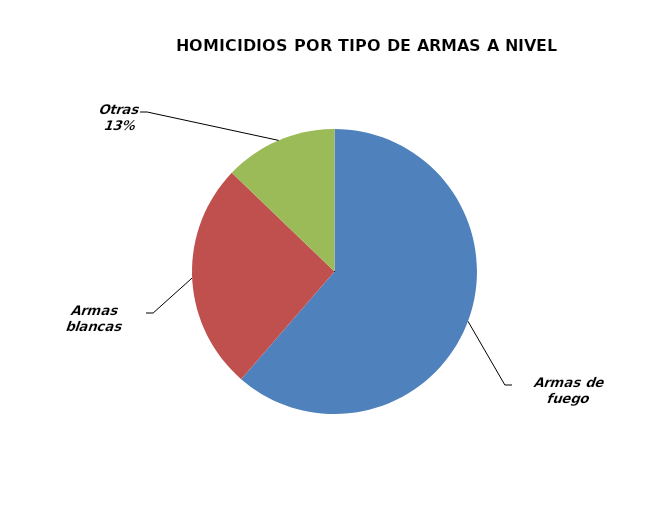
| Category | Series 0 |
|---|---|
| Armas de fuego | 340 |
| Armas blancas | 143 |
| Otras | 71 |